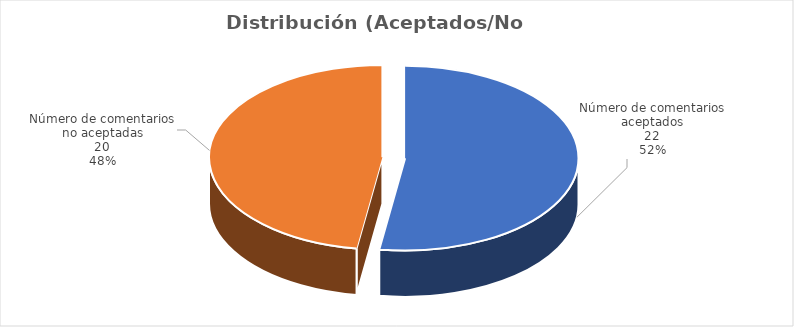
| Category | Series 0 |
|---|---|
| Número de comentarios aceptados | 22 |
| Número de comentarios no aceptadas | 20 |